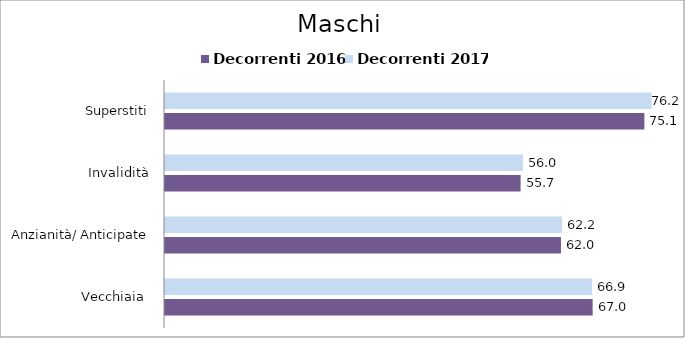
| Category | Decorrenti 2016 | Decorrenti 2017 |
|---|---|---|
| Vecchiaia  | 66.95 | 66.86 |
| Anzianità/ Anticipate | 61.99 | 62.17 |
| Invalidità | 55.67 | 56.03 |
| Superstiti | 75.05 | 76.18 |